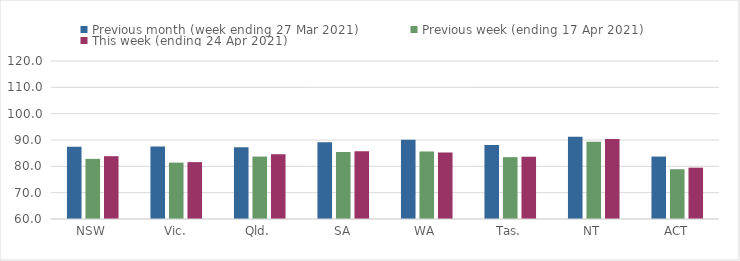
| Category | Previous month (week ending 27 Mar 2021) | Previous week (ending 17 Apr 2021) | This week (ending 24 Apr 2021) |
|---|---|---|---|
| NSW | 87.43 | 82.84 | 83.85 |
| Vic. | 87.54 | 81.42 | 81.6 |
| Qld. | 87.29 | 83.71 | 84.56 |
| SA | 89.1 | 85.47 | 85.73 |
| WA | 90.08 | 85.65 | 85.21 |
| Tas. | 88.08 | 83.48 | 83.65 |
| NT | 91.23 | 89.31 | 90.4 |
| ACT | 83.71 | 78.9 | 79.49 |